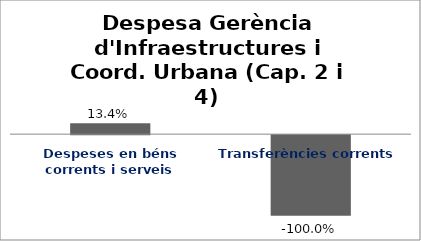
| Category | Series 0 |
|---|---|
| Despeses en béns corrents i serveis | 0.134 |
| Transferències corrents | -1 |